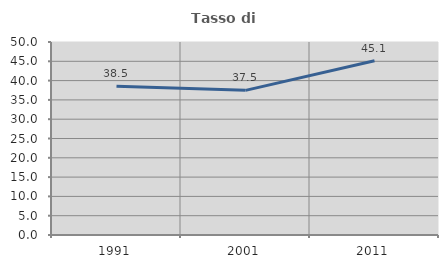
| Category | Tasso di occupazione   |
|---|---|
| 1991.0 | 38.522 |
| 2001.0 | 37.471 |
| 2011.0 | 45.129 |